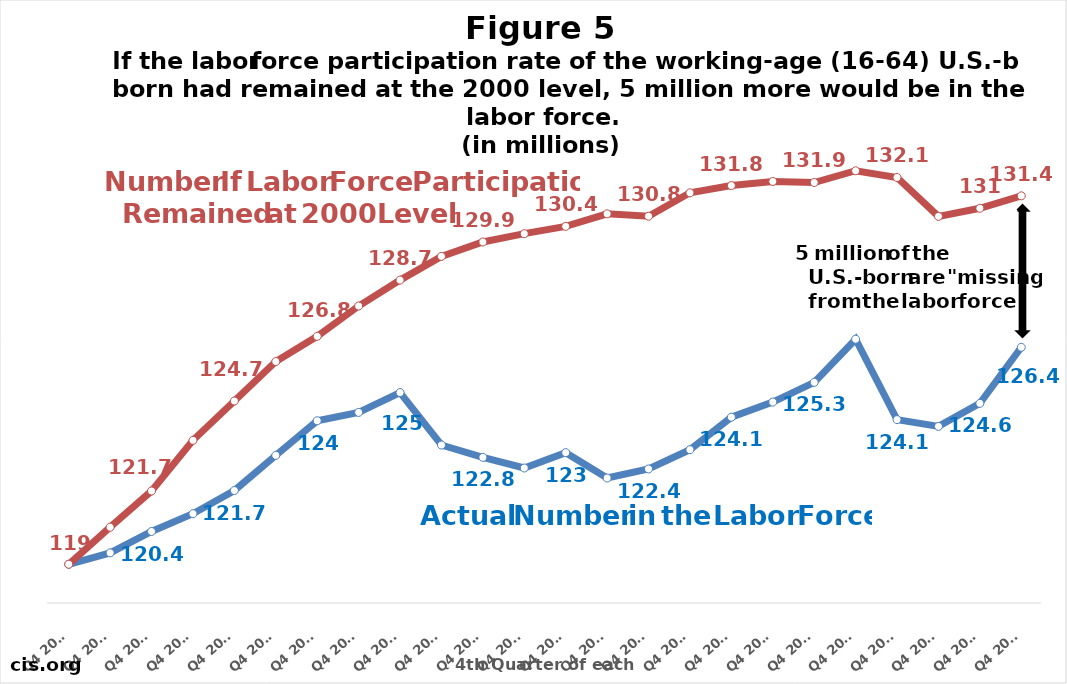
| Category |  Actual number  in the labor force  | Series 1 |
|---|---|---|
| Q4 2000 | 119.279 | 119.279 |
| Q4 2001 | 119.656 | 120.503 |
| Q4 2002 | 120.361 | 121.699 |
| Q4 2003 | 120.95 | 123.374 |
| Q4 2004 | 121.715 | 124.672 |
| Q4 2005 | 122.876 | 125.975 |
| Q4 2006 | 124.019 | 126.808 |
| Q4 2007 | 124.295 | 127.809 |
| Q4 2008 | 124.951 | 128.666 |
| Q4 2009 | 123.217 | 129.448 |
| Q4 2010 | 122.809 | 129.924 |
| Q4 2011 | 122.458 | 130.199 |
| Q4 2012 | 122.966 | 130.44 |
| Q4 2013 | 122.128 | 130.855 |
| Q4 2014 | 122.427 | 130.774 |
| Q4 2015 | 123.064 | 131.548 |
| Q4 2016 | 124.138 | 131.788 |
| Q4 2017 | 124.637 | 131.923 |
| Q4 2018 | 125.288 | 131.889 |
| Q4 2019 | 126.712 | 132.277 |
| Q4 2020 | 124.056 | 132.055 |
| Q4 2021 | 123.833 | 130.77 |
| Q4 2022 | 124.593 | 131.037 |
| Q4 2023 | 126.446 | 131.448 |